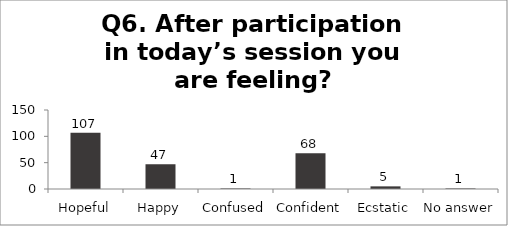
| Category | Q6. After participation in today’s session you are feeling? |
|---|---|
| Hopeful | 107 |
| Happy | 47 |
| Confused | 1 |
| Confident | 68 |
| Ecstatic | 5 |
| No answer | 1 |